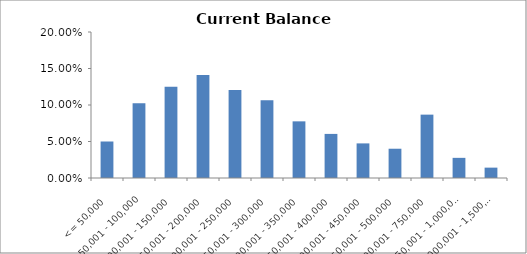
| Category | Series1 |
|---|---|
| <= 50,000 | 0.05 |
| 50,001 - 100,000 | 0.102 |
| 100,001 - 150,000 | 0.125 |
| 150,001 - 200,000 | 0.141 |
| 200,001 - 250,000 | 0.121 |
| 250,001 - 300,000 | 0.106 |
| 300,001 - 350,000 | 0.078 |
| 350,001 - 400,000 | 0.06 |
| 400,001 - 450,000 | 0.047 |
| 450,001 - 500,000 | 0.04 |
| 500,001 - 750,000 | 0.087 |
| 750,001 - 1,000,000 | 0.028 |
| 1,000,001 - 1,500,000 | 0.014 |